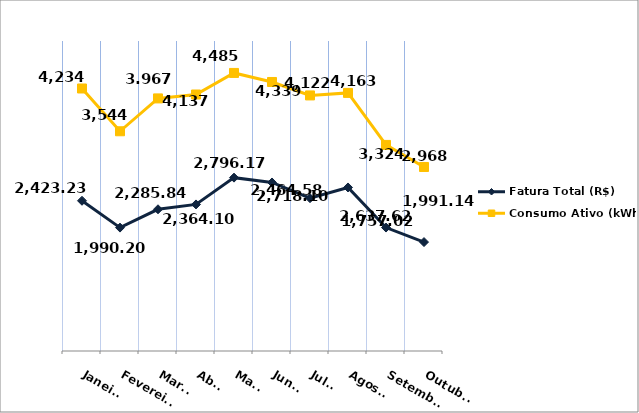
| Category | Fatura Total (R$) |
|---|---|
| Janeiro | 2423.23 |
| Fevereiro | 1990.2 |
| Março | 2285.84 |
| Abril | 2364.1 |
| Maio | 2796.17 |
| Junho | 2718.1 |
| Julho | 2464.58 |
| Agosto | 2637.62 |
| Setembro | 1991.14 |
| Outubro | 1757.02 |